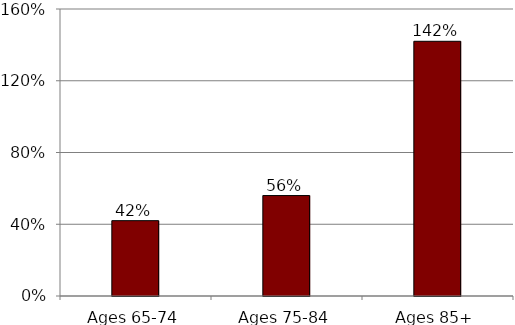
| Category | Series 0 |
|---|---|
| Ages 65-74 | 0.42 |
| Ages 75-84 | 0.56 |
| Ages 85+ | 1.42 |